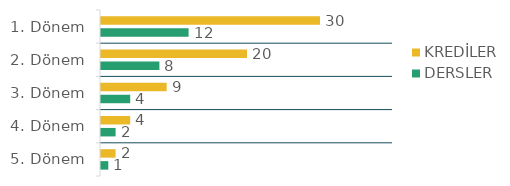
| Category | KREDİLER  | DERSLER   |
|---|---|---|
| 1. Dönem | 30 | 12 |
| 2. Dönem | 20 | 8 |
| 3. Dönem | 9 | 4 |
| 4. Dönem | 4 | 2 |
| 5. Dönem | 2 | 1 |